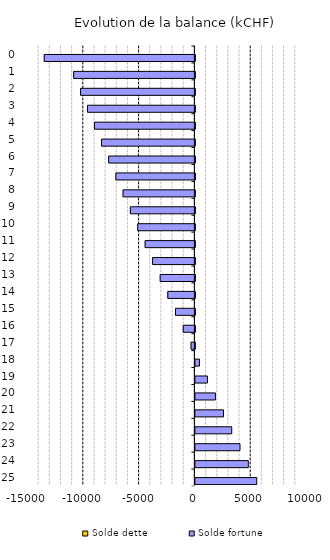
| Category | Solde dette | Solde fortune |
|---|---|---|
| 0.0 | 0 | -13500 |
| 1.0 | 0 | -10863 |
| 2.0 | 0 | -10246.109 |
| 3.0 | 0 | -9624.237 |
| 4.0 | 0 | -8997.297 |
| 5.0 | 0 | -8365.197 |
| 6.0 | 0 | -7727.851 |
| 7.0 | 0 | -7085.167 |
| 8.0 | 0 | -6437.057 |
| 9.0 | 0 | -5783.433 |
| 10.0 | 0 | -5124.206 |
| 11.0 | 0 | -4459.288 |
| 12.0 | 0 | -3788.59 |
| 13.0 | 0 | -3112.025 |
| 14.0 | 0 | -2429.507 |
| 15.0 | 0 | -1740.948 |
| 16.0 | 0 | -1046.264 |
| 17.0 | 0 | -345.37 |
| 18.0 | 0 | 361.819 |
| 19.0 | 0 | 1075.385 |
| 20.0 | 0 | 1795.41 |
| 21.0 | 0 | 2521.976 |
| 22.0 | 0 | 3255.16 |
| 23.0 | 0 | 3995.042 |
| 24.0 | 0 | 4741.698 |
| 25.0 | 0 | 5495.202 |